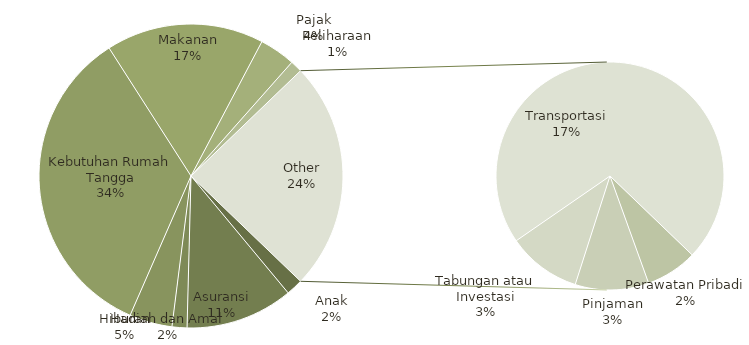
| Category | Total |
|---|---|
| Anak | 140 |
| Asuransi | 900 |
| Hadiah dan Amal | 125 |
| Hiburan | 358 |
| Kebutuhan Rumah Tangga | 2702 |
| Makanan | 1320 |
| Pajak | 300 |
| Peliharaan | 100 |
| Perawatan Pribadi | 140 |
| Pinjaman | 200 |
| Tabungan atau Investasi | 200 |
| Transportasi | 1375 |